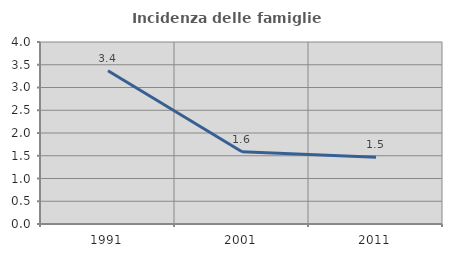
| Category | Incidenza delle famiglie numerose |
|---|---|
| 1991.0 | 3.367 |
| 2001.0 | 1.586 |
| 2011.0 | 1.47 |